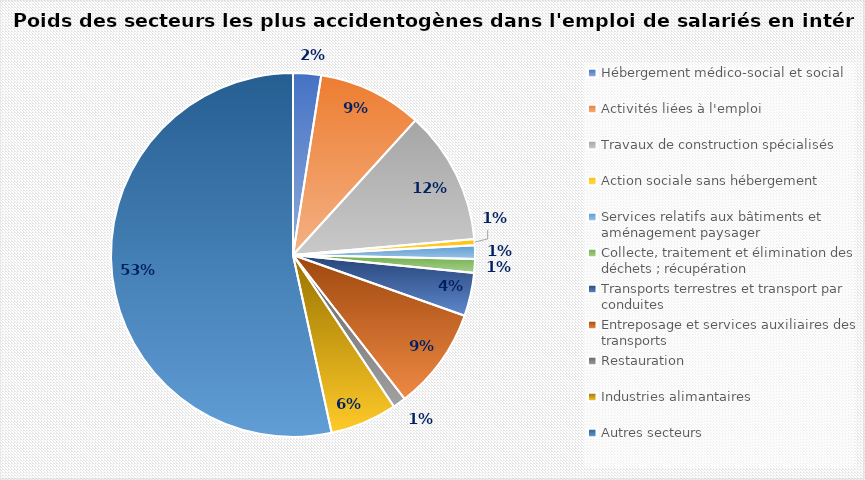
| Category | Series 0 |
|---|---|
| Hébergement médico-social et social | 0.025 |
| Activités liées à l'emploi | 0.093 |
| Travaux de construction spécialisés | 0.119 |
| Action sociale sans hébergement | 0.005 |
| Services relatifs aux bâtiments et aménagement paysager | 0.012 |
| Collecte, traitement et élimination des déchets ; récupération | 0.012 |
| Transports terrestres et transport par conduites | 0.038 |
| Entreposage et services auxiliaires des transports | 0.091 |
| Restauration | 0.012 |
| Industries alimantaires | 0.059 |
| Autres secteurs | 0.534 |